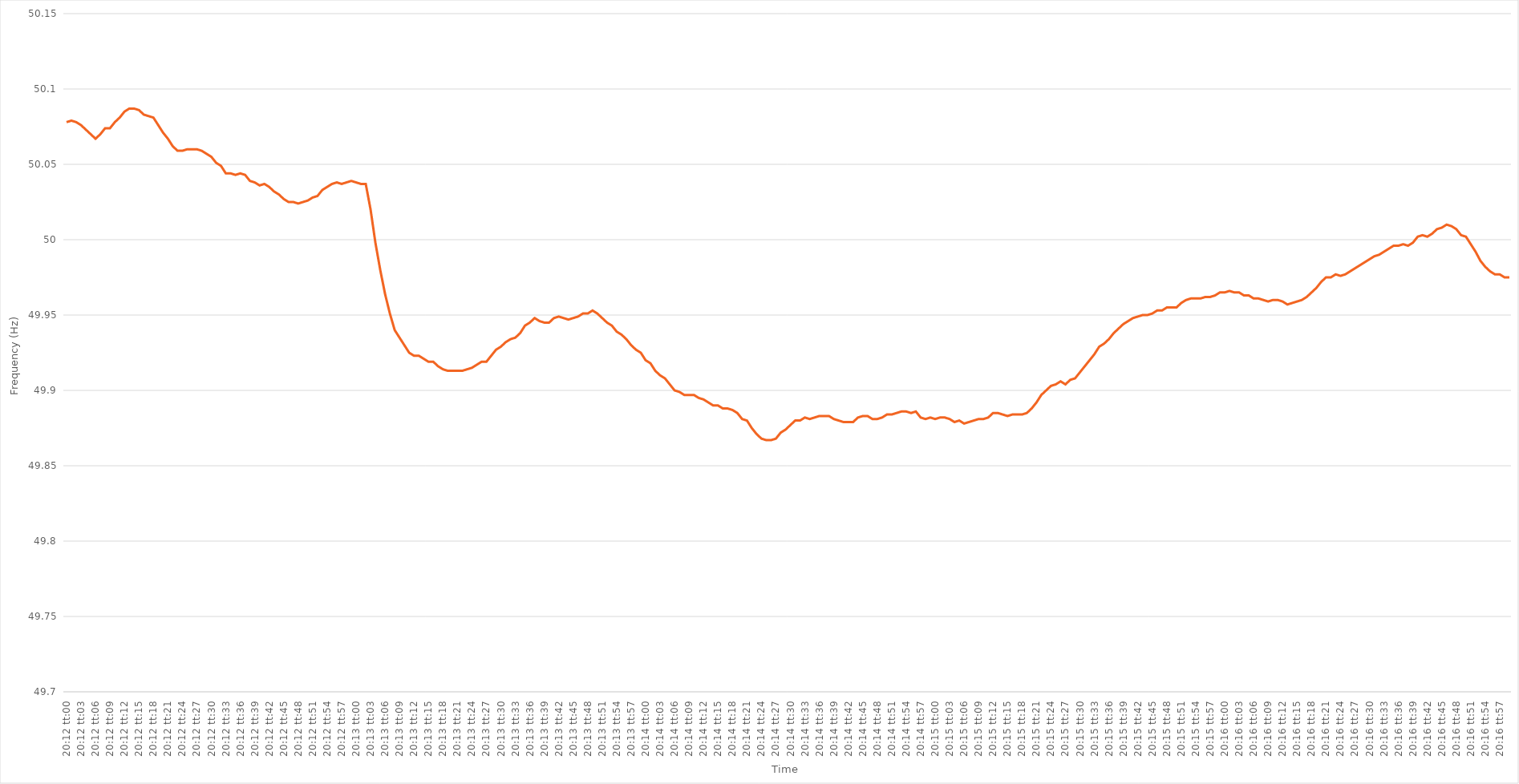
| Category | Series 0 |
|---|---|
| 0.8416666666666667 | 50.078 |
| 0.8416782407407407 | 50.079 |
| 0.8416898148148149 | 50.078 |
| 0.8417013888888888 | 50.076 |
| 0.8417129629629629 | 50.073 |
| 0.8417245370370371 | 50.07 |
| 0.8417361111111111 | 50.067 |
| 0.8417476851851852 | 50.07 |
| 0.8417592592592592 | 50.074 |
| 0.8417708333333334 | 50.074 |
| 0.8417824074074075 | 50.078 |
| 0.8417939814814814 | 50.081 |
| 0.8418055555555556 | 50.085 |
| 0.8418171296296296 | 50.087 |
| 0.8418287037037038 | 50.087 |
| 0.8418402777777777 | 50.086 |
| 0.8418518518518519 | 50.083 |
| 0.841863425925926 | 50.082 |
| 0.8418749999999999 | 50.081 |
| 0.8418865740740741 | 50.076 |
| 0.8418981481481481 | 50.071 |
| 0.8419097222222223 | 50.067 |
| 0.8419212962962962 | 50.062 |
| 0.8419328703703703 | 50.059 |
| 0.8419444444444445 | 50.059 |
| 0.8419560185185185 | 50.06 |
| 0.8419675925925926 | 50.06 |
| 0.8419791666666666 | 50.06 |
| 0.8419907407407408 | 50.059 |
| 0.8420023148148149 | 50.057 |
| 0.8420138888888888 | 50.055 |
| 0.842025462962963 | 50.051 |
| 0.842037037037037 | 50.049 |
| 0.8420486111111112 | 50.044 |
| 0.8420601851851851 | 50.044 |
| 0.8420717592592593 | 50.043 |
| 0.8420833333333334 | 50.044 |
| 0.8420949074074073 | 50.043 |
| 0.8421064814814815 | 50.039 |
| 0.8421180555555555 | 50.038 |
| 0.8421296296296297 | 50.036 |
| 0.8421412037037036 | 50.037 |
| 0.8421527777777778 | 50.035 |
| 0.8421643518518519 | 50.032 |
| 0.8421759259259259 | 50.03 |
| 0.8421875 | 50.027 |
| 0.842199074074074 | 50.025 |
| 0.8422106481481482 | 50.025 |
| 0.8422222222222223 | 50.024 |
| 0.8422337962962962 | 50.025 |
| 0.8422453703703704 | 50.026 |
| 0.8422569444444444 | 50.028 |
| 0.8422685185185186 | 50.029 |
| 0.8422800925925925 | 50.033 |
| 0.8422916666666667 | 50.035 |
| 0.8423032407407408 | 50.037 |
| 0.8423148148148148 | 50.038 |
| 0.8423263888888889 | 50.037 |
| 0.8423379629629629 | 50.038 |
| 0.8423495370370371 | 50.039 |
| 0.842361111111111 | 50.038 |
| 0.8423726851851852 | 50.037 |
| 0.8423842592592593 | 50.037 |
| 0.8423958333333333 | 50.02 |
| 0.8424074074074074 | 49.998 |
| 0.8424189814814814 | 49.98 |
| 0.8424305555555556 | 49.964 |
| 0.8424421296296297 | 49.951 |
| 0.8424537037037036 | 49.94 |
| 0.8424652777777778 | 49.935 |
| 0.8424768518518518 | 49.93 |
| 0.842488425925926 | 49.925 |
| 0.8424999999999999 | 49.923 |
| 0.8425115740740741 | 49.923 |
| 0.8425231481481482 | 49.921 |
| 0.8425347222222223 | 49.919 |
| 0.8425462962962963 | 49.919 |
| 0.8425578703703703 | 49.916 |
| 0.8425694444444445 | 49.914 |
| 0.8425810185185184 | 49.913 |
| 0.8425925925925926 | 49.913 |
| 0.8426041666666667 | 49.913 |
| 0.8426157407407407 | 49.913 |
| 0.8426273148148148 | 49.914 |
| 0.8426388888888888 | 49.915 |
| 0.842650462962963 | 49.917 |
| 0.8426620370370371 | 49.919 |
| 0.842673611111111 | 49.919 |
| 0.8426851851851852 | 49.923 |
| 0.8426967592592592 | 49.927 |
| 0.8427083333333334 | 49.929 |
| 0.8427199074074073 | 49.932 |
| 0.8427314814814815 | 49.934 |
| 0.8427430555555556 | 49.935 |
| 0.8427546296296297 | 49.938 |
| 0.8427662037037037 | 49.943 |
| 0.8427777777777777 | 49.945 |
| 0.8427893518518519 | 49.948 |
| 0.842800925925926 | 49.946 |
| 0.8428125 | 49.945 |
| 0.8428240740740741 | 49.945 |
| 0.8428356481481482 | 49.948 |
| 0.8428472222222222 | 49.949 |
| 0.8428587962962962 | 49.948 |
| 0.8428703703703704 | 49.947 |
| 0.8428819444444445 | 49.948 |
| 0.8428935185185185 | 49.949 |
| 0.8429050925925926 | 49.951 |
| 0.8429166666666666 | 49.951 |
| 0.8429282407407408 | 49.953 |
| 0.8429398148148147 | 49.951 |
| 0.8429513888888889 | 49.948 |
| 0.842962962962963 | 49.945 |
| 0.8429745370370371 | 49.943 |
| 0.8429861111111111 | 49.939 |
| 0.8429976851851851 | 49.937 |
| 0.8430092592592593 | 49.934 |
| 0.8430208333333334 | 49.93 |
| 0.8430324074074074 | 49.927 |
| 0.8430439814814815 | 49.925 |
| 0.8430555555555556 | 49.92 |
| 0.8430671296296296 | 49.918 |
| 0.8430787037037036 | 49.913 |
| 0.8430902777777778 | 49.91 |
| 0.8431018518518519 | 49.908 |
| 0.8431134259259259 | 49.904 |
| 0.843125 | 49.9 |
| 0.843136574074074 | 49.899 |
| 0.8431481481481482 | 49.897 |
| 0.8431597222222221 | 49.897 |
| 0.8431712962962963 | 49.897 |
| 0.8431828703703704 | 49.895 |
| 0.8431944444444445 | 49.894 |
| 0.8432060185185185 | 49.892 |
| 0.8432175925925925 | 49.89 |
| 0.8432291666666667 | 49.89 |
| 0.8432407407407408 | 49.888 |
| 0.8432523148148148 | 49.888 |
| 0.8432638888888889 | 49.887 |
| 0.843275462962963 | 49.885 |
| 0.843287037037037 | 49.881 |
| 0.843298611111111 | 49.88 |
| 0.8433101851851852 | 49.875 |
| 0.8433217592592593 | 49.871 |
| 0.8433333333333333 | 49.868 |
| 0.8433449074074074 | 49.867 |
| 0.8433564814814815 | 49.867 |
| 0.8433680555555556 | 49.868 |
| 0.8433796296296295 | 49.872 |
| 0.8433912037037037 | 49.874 |
| 0.8434027777777778 | 49.877 |
| 0.8434143518518519 | 49.88 |
| 0.8434259259259259 | 49.88 |
| 0.8434375 | 49.882 |
| 0.8434490740740741 | 49.881 |
| 0.8434606481481483 | 49.882 |
| 0.8434722222222222 | 49.883 |
| 0.8434837962962963 | 49.883 |
| 0.8434953703703704 | 49.883 |
| 0.8435069444444445 | 49.881 |
| 0.8435185185185184 | 49.88 |
| 0.8435300925925926 | 49.879 |
| 0.8435416666666667 | 49.879 |
| 0.8435532407407407 | 49.879 |
| 0.8435648148148148 | 49.882 |
| 0.8435763888888889 | 49.883 |
| 0.843587962962963 | 49.883 |
| 0.8435995370370369 | 49.881 |
| 0.8436111111111111 | 49.881 |
| 0.8436226851851852 | 49.882 |
| 0.8436342592592593 | 49.884 |
| 0.8436458333333333 | 49.884 |
| 0.8436574074074074 | 49.885 |
| 0.8436689814814815 | 49.886 |
| 0.8436805555555557 | 49.886 |
| 0.8436921296296296 | 49.885 |
| 0.8437037037037037 | 49.886 |
| 0.8437152777777778 | 49.882 |
| 0.8437268518518519 | 49.881 |
| 0.8437384259259259 | 49.882 |
| 0.84375 | 49.881 |
| 0.8437615740740741 | 49.882 |
| 0.8437731481481481 | 49.882 |
| 0.8437847222222222 | 49.881 |
| 0.8437962962962963 | 49.879 |
| 0.8438078703703704 | 49.88 |
| 0.8438194444444443 | 49.878 |
| 0.8438310185185185 | 49.879 |
| 0.8438425925925926 | 49.88 |
| 0.8438541666666667 | 49.881 |
| 0.8438657407407407 | 49.881 |
| 0.8438773148148148 | 49.882 |
| 0.8438888888888889 | 49.885 |
| 0.8439004629629631 | 49.885 |
| 0.843912037037037 | 49.884 |
| 0.8439236111111111 | 49.883 |
| 0.8439351851851852 | 49.884 |
| 0.8439467592592593 | 49.884 |
| 0.8439583333333333 | 49.884 |
| 0.8439699074074074 | 49.885 |
| 0.8439814814814816 | 49.888 |
| 0.8439930555555555 | 49.892 |
| 0.8440046296296296 | 49.897 |
| 0.8440162037037037 | 49.9 |
| 0.8440277777777778 | 49.903 |
| 0.8440393518518517 | 49.904 |
| 0.8440509259259259 | 49.906 |
| 0.8440625 | 49.904 |
| 0.8440740740740741 | 49.907 |
| 0.8440856481481481 | 49.908 |
| 0.8440972222222222 | 49.912 |
| 0.8441087962962963 | 49.916 |
| 0.8441203703703705 | 49.92 |
| 0.8441319444444444 | 49.924 |
| 0.8441435185185185 | 49.929 |
| 0.8441550925925926 | 49.931 |
| 0.8441666666666667 | 49.934 |
| 0.8441782407407407 | 49.938 |
| 0.8441898148148148 | 49.941 |
| 0.844201388888889 | 49.944 |
| 0.844212962962963 | 49.946 |
| 0.844224537037037 | 49.948 |
| 0.8442361111111111 | 49.949 |
| 0.8442476851851852 | 49.95 |
| 0.8442592592592592 | 49.95 |
| 0.8442708333333333 | 49.951 |
| 0.8442824074074075 | 49.953 |
| 0.8442939814814815 | 49.953 |
| 0.8443055555555555 | 49.955 |
| 0.8443171296296296 | 49.955 |
| 0.8443287037037037 | 49.955 |
| 0.8443402777777779 | 49.958 |
| 0.8443518518518518 | 49.96 |
| 0.844363425925926 | 49.961 |
| 0.844375 | 49.961 |
| 0.8443865740740741 | 49.961 |
| 0.8443981481481481 | 49.962 |
| 0.8444097222222222 | 49.962 |
| 0.8444212962962964 | 49.963 |
| 0.8444328703703704 | 49.965 |
| 0.8444444444444444 | 49.965 |
| 0.8444560185185185 | 49.966 |
| 0.8444675925925926 | 49.965 |
| 0.8444791666666666 | 49.965 |
| 0.8444907407407407 | 49.963 |
| 0.8445023148148149 | 49.963 |
| 0.8445138888888889 | 49.961 |
| 0.8445254629629629 | 49.961 |
| 0.844537037037037 | 49.96 |
| 0.8445486111111111 | 49.959 |
| 0.8445601851851853 | 49.96 |
| 0.8445717592592592 | 49.96 |
| 0.8445833333333334 | 49.959 |
| 0.8445949074074074 | 49.957 |
| 0.8446064814814815 | 49.958 |
| 0.8446180555555555 | 49.959 |
| 0.8446296296296296 | 49.96 |
| 0.8446412037037038 | 49.962 |
| 0.8446527777777778 | 49.965 |
| 0.8446643518518518 | 49.968 |
| 0.8446759259259259 | 49.972 |
| 0.8446875 | 49.975 |
| 0.844699074074074 | 49.975 |
| 0.8447106481481481 | 49.977 |
| 0.8447222222222223 | 49.976 |
| 0.8447337962962963 | 49.977 |
| 0.8447453703703703 | 49.979 |
| 0.8447569444444444 | 49.981 |
| 0.8447685185185185 | 49.983 |
| 0.8447800925925927 | 49.985 |
| 0.8447916666666666 | 49.987 |
| 0.8448032407407408 | 49.989 |
| 0.8448148148148148 | 49.99 |
| 0.844826388888889 | 49.992 |
| 0.8448379629629629 | 49.994 |
| 0.844849537037037 | 49.996 |
| 0.8448611111111112 | 49.996 |
| 0.8448726851851852 | 49.997 |
| 0.8448842592592593 | 49.996 |
| 0.8448958333333333 | 49.998 |
| 0.8449074074074074 | 50.002 |
| 0.8449189814814816 | 50.003 |
| 0.8449305555555555 | 50.002 |
| 0.8449421296296297 | 50.004 |
| 0.8449537037037037 | 50.007 |
| 0.8449652777777777 | 50.008 |
| 0.8449768518518518 | 50.01 |
| 0.8449884259259259 | 50.009 |
| 0.8450000000000001 | 50.007 |
| 0.845011574074074 | 50.003 |
| 0.8450231481481482 | 50.002 |
| 0.8450347222222222 | 49.997 |
| 0.8450462962962964 | 49.992 |
| 0.8450578703703703 | 49.986 |
| 0.8450694444444444 | 49.982 |
| 0.8450810185185186 | 49.979 |
| 0.8450925925925926 | 49.977 |
| 0.8451041666666667 | 49.977 |
| 0.8451157407407407 | 49.975 |
| 0.8451273148148148 | 49.975 |